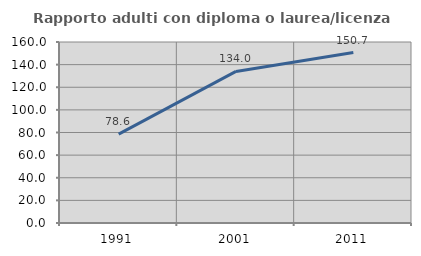
| Category | Rapporto adulti con diploma o laurea/licenza media  |
|---|---|
| 1991.0 | 78.585 |
| 2001.0 | 133.995 |
| 2011.0 | 150.71 |